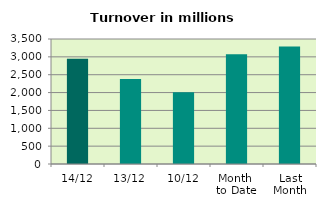
| Category | Series 0 |
|---|---|
| 14/12 | 2949.731 |
| 13/12 | 2376.543 |
| 10/12 | 2007.797 |
| Month 
to Date | 3073.421 |
| Last
Month | 3292.145 |